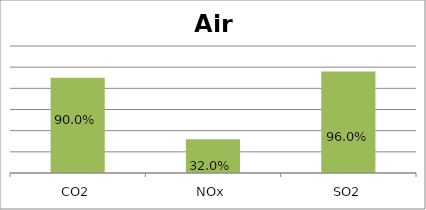
| Category | Air Emissions |
|---|---|
| CO2 | 0.9 |
| NOx | 0.32 |
| SO2 | 0.96 |